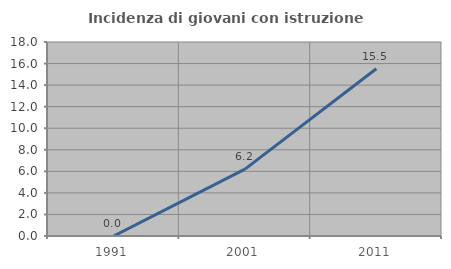
| Category | Incidenza di giovani con istruzione universitaria |
|---|---|
| 1991.0 | 0 |
| 2001.0 | 6.207 |
| 2011.0 | 15.517 |